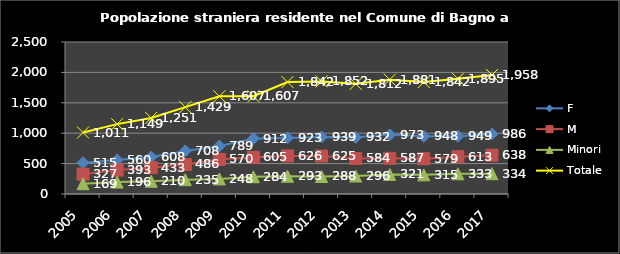
| Category | F | M | Minori | Totale |
|---|---|---|---|---|
| 2005.0 | 515 | 327 | 169 | 1011 |
| 2006.0 | 560 | 393 | 196 | 1149 |
| 2007.0 | 608 | 433 | 210 | 1251 |
| 2008.0 | 708 | 486 | 235 | 1429 |
| 2009.0 | 789 | 570 | 248 | 1607 |
| 2010.0 | 912 | 605 | 284 | 1607 |
| 2011.0 | 923 | 626 | 293 | 1842 |
| 2012.0 | 939 | 625 | 288 | 1852 |
| 2013.0 | 932 | 584 | 296 | 1812 |
| 2014.0 | 973 | 587 | 321 | 1881 |
| 2015.0 | 948 | 579 | 315 | 1842 |
| 2016.0 | 949 | 613 | 333 | 1895 |
| 2017.0 | 986 | 638 | 334 | 1958 |